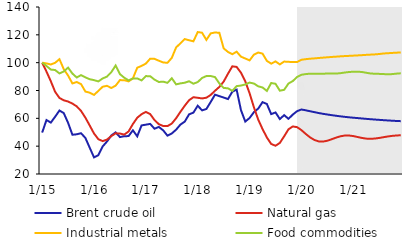
| Category | Brent crude oil | Natural gas | Industrial metals | Food commodities |
|---|---|---|---|---|
|  1/15 | 49.758 | 100 | 100 | 100 |
| 2 | 58.795 | 93.587 | 99.447 | 97.61 |
| 3 | 56.939 | 86.683 | 98.693 | 95.043 |
| 4 | 61.136 | 79.043 | 99.909 | 94.708 |
| 5 | 65.609 | 74.666 | 102.511 | 92.252 |
| 6 | 63.753 | 72.949 | 95.305 | 93.666 |
| 7 | 56.764 | 72.072 | 90.715 | 96.445 |
| 8 | 48.206 | 70.601 | 85.084 | 92.155 |
| 9 | 48.54 | 68.591 | 86.114 | 89.356 |
| 10 | 49.293 | 65.314 | 84.586 | 91.06 |
| 11 | 45.932 | 60.5 | 79.257 | 89.434 |
| 12 | 38.904 | 54.867 | 78.434 | 88.105 |
|  1/16 | 31.926 | 49.108 | 76.848 | 87.452 |
| 2 | 33.527 | 45.013 | 79.703 | 86.547 |
| 3 | 39.79 | 43.643 | 82.692 | 88.65 |
| 4 | 43.34 | 44.699 | 83.376 | 89.984 |
| 5 | 47.647 | 47.228 | 81.811 | 93.168 |
| 6 | 49.927 | 49.233 | 83.482 | 97.947 |
| 7 | 46.535 | 49.096 | 87.466 | 91.753 |
| 8 | 47.159 | 48.301 | 87.426 | 89.188 |
| 9 | 47.24 | 50.589 | 86.546 | 87.268 |
| 10 | 51.388 | 55.926 | 88.713 | 88.629 |
| 11 | 47.079 | 60.421 | 96.356 | 88.705 |
| 12 | 54.916 | 62.973 | 97.676 | 87.26 |
|  1/17 | 55.448 | 64.621 | 99.349 | 90.348 |
| 2 | 55.996 | 63.025 | 102.875 | 90.261 |
| 3 | 52.539 | 58.736 | 102.74 | 87.811 |
| 4 | 53.819 | 55.798 | 101.399 | 86.112 |
| 5 | 51.39 | 54.498 | 100.17 | 86.362 |
| 6 | 47.554 | 54.411 | 99.885 | 85.51 |
| 7 | 49.149 | 56.249 | 103.485 | 88.802 |
| 8 | 51.87 | 60.081 | 110.967 | 84.404 |
| 9 | 55.515 | 64.703 | 113.902 | 85.12 |
| 10 | 57.649 | 69.083 | 116.948 | 85.594 |
| 11 | 62.866 | 73.02 | 116.113 | 86.634 |
| 12 | 64.092 | 75.179 | 115.333 | 84.884 |
|  1/18 | 69.079 | 74.765 | 121.995 | 86.058 |
| 2 | 65.73 | 74.31 | 121.52 | 88.987 |
| 3 | 66.72 | 74.807 | 116.383 | 90.396 |
| 4 | 71.762 | 76.83 | 121.054 | 90.402 |
| 5 | 77.007 | 79.814 | 121.7 | 89.631 |
| 6 | 75.941 | 82.558 | 121.455 | 85.084 |
| 7 | 74.952 | 86.406 | 110.297 | 81.836 |
| 8 | 73.842 | 92.054 | 107.71 | 81.576 |
| 9 | 79.11 | 97.36 | 106.076 | 79.731 |
| 10 | 80.63 | 96.966 | 107.899 | 83.137 |
| 11 | 65.949 | 92.833 | 104.332 | 83.564 |
| 12 | 57.674 | 86.601 | 103 | 84.318 |
|  1/19 | 60.241 | 78.008 | 101.636 | 85.695 |
| 2 | 64.432 | 67.932 | 105.768 | 85.01 |
| 3 | 67.028 | 59.069 | 107.285 | 83.005 |
| 4 | 71.629 | 52.265 | 106.48 | 82.161 |
| 5 | 70.303 | 46.249 | 101.269 | 79.693 |
| 6 | 63.038 | 41.584 | 99.317 | 85.393 |
| 7 | 64.215 | 40.305 | 100.898 | 84.823 |
| 8 | 59.502 | 42.334 | 98.74 | 79.868 |
| 9 | 62.287 | 47.09 | 100.797 | 80.494 |
| 10 | 59.632 | 52.121 | 100.585 | 85.025 |
| 11 | 62.71 | 54.174 | 100.505 | 86.782 |
| 12 | 65.174 | 53.644 | 100.46 | 89.747 |
|  1/20 | 66.355 | 51.51 | 102.093 | 91.316 |
| 2 | 65.762 | 48.791 | 102.517 | 91.795 |
| 3 | 65.095 | 46.301 | 102.835 | 92.101 |
| 4 | 64.45 | 44.452 | 103.071 | 92.049 |
| 5 | 63.8 | 43.419 | 103.367 | 91.952 |
| 6 | 63.244 | 43.312 | 103.616 | 92.055 |
| 7 | 62.752 | 43.911 | 103.861 | 92.199 |
| 8 | 62.284 | 44.981 | 104.112 | 92.196 |
| 9 | 61.853 | 46.12 | 104.317 | 92.157 |
| 10 | 61.436 | 47.075 | 104.545 | 92.443 |
| 11 | 61.077 | 47.624 | 104.731 | 92.902 |
| 12 | 60.739 | 47.664 | 104.892 | 93.281 |
|  1/21 | 60.444 | 47.25 | 105.049 | 93.503 |
| 2 | 60.18 | 46.577 | 105.218 | 93.531 |
| 3 | 59.899 | 45.897 | 105.398 | 93.287 |
| 4 | 59.622 | 45.428 | 105.606 | 92.745 |
| 5 | 59.365 | 45.288 | 105.783 | 92.21 |
| 6 | 59.127 | 45.478 | 105.951 | 92.048 |
| 7 | 58.901 | 45.908 | 106.211 | 91.945 |
| 8 | 58.687 | 46.448 | 106.604 | 91.811 |
| 9 | 58.482 | 46.971 | 106.787 | 91.622 |
| 10 | 58.281 | 47.393 | 107 | 91.786 |
| 11 | 58.113 | 47.677 | 107.178 | 92.119 |
| 12 | 57.96 | 47.844 | 107.355 | 92.366 |